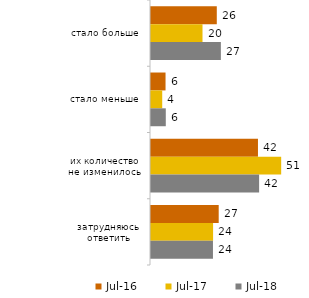
| Category | июл.16 | июл.17 | июл.18 |
|---|---|---|---|
| стало больше | 25.8 | 20.2 | 27.4 |
| стало меньше | 5.7 | 4.4 | 5.8 |
| их количество не изменилось | 41.95 | 51.05 | 42.4 |
| затрудняюсь ответить | 26.55 | 24.35 | 24.3 |